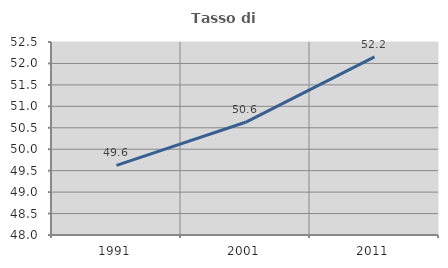
| Category | Tasso di occupazione   |
|---|---|
| 1991.0 | 49.623 |
| 2001.0 | 50.628 |
| 2011.0 | 52.153 |